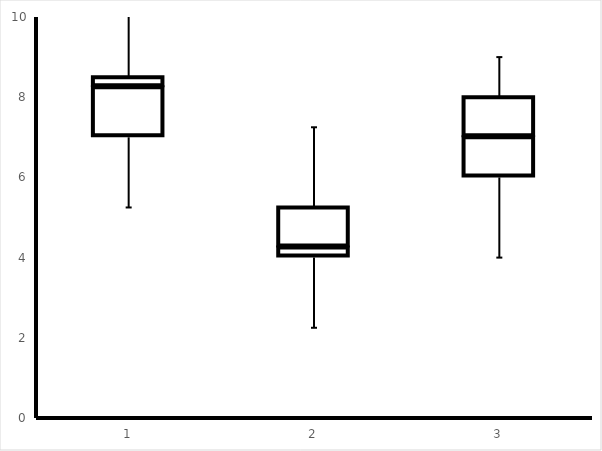
| Category | Series 0 | Series 1 | Series 2 |
|---|---|---|---|
| 0 | 7 | 1.25 | 0.25 |
| 1 | 4 | 0.25 | 1 |
| 2 | 6 | 1 | 1 |